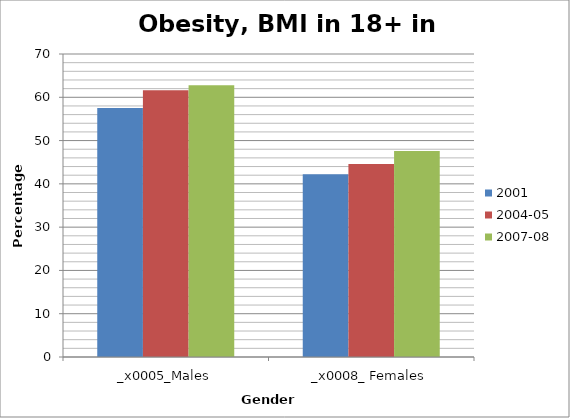
| Category | 2001 | 2004-05 | 2007-08 |
|---|---|---|---|
| 0 | 57.5 | 61.6 | 62.8 |
| 1 | 42.2 | 44.6 | 47.6 |